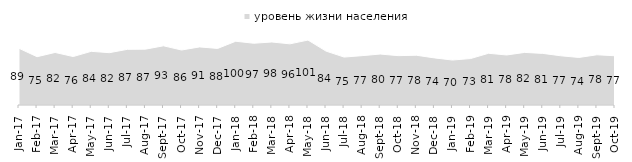
| Category | уровень жизни населения |
|---|---|
| 2017-01-01 | 88.55 |
| 2017-02-01 | 75.45 |
| 2017-03-01 | 82.1 |
| 2017-04-01 | 75.7 |
| 2017-05-01 | 83.85 |
| 2017-06-01 | 81.75 |
| 2017-07-01 | 86.95 |
| 2017-08-01 | 87.25 |
| 2017-09-01 | 92.5 |
| 2017-10-01 | 85.9 |
| 2017-11-01 | 90.75 |
| 2017-12-01 | 88.4 |
| 2018-01-01 | 99.6 |
| 2018-02-01 | 96.5 |
| 2018-03-01 | 98.45 |
| 2018-04-01 | 95.55 |
| 2018-05-01 | 101.45 |
| 2018-06-01 | 84.2 |
| 2018-07-01 | 74.9 |
| 2018-08-01 | 77.1 |
| 2018-09-01 | 79.6 |
| 2018-10-01 | 77.1 |
| 2018-11-01 | 77.745 |
| 2018-12-01 | 73.6 |
| 2019-01-01 | 70.25 |
| 2019-02-01 | 72.55 |
| 2019-03-01 | 80.806 |
| 2019-04-01 | 78.168 |
| 2019-05-01 | 82.169 |
| 2019-06-01 | 80.648 |
| 2019-07-01 | 76.881 |
| 2019-08-01 | 74.276 |
| 2019-09-01 | 78.465 |
| 2019-10-01 | 76.931 |